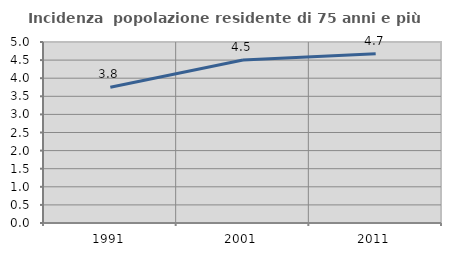
| Category | Incidenza  popolazione residente di 75 anni e più |
|---|---|
| 1991.0 | 3.751 |
| 2001.0 | 4.502 |
| 2011.0 | 4.672 |